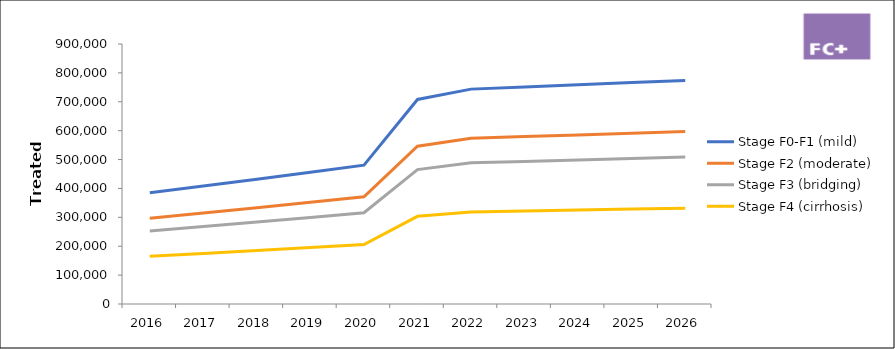
| Category | Stage F0-F1 (mild) | Stage F2 (moderate) | Stage F3 (bridging) | Stage F4 (cirrhosis) |
|---|---|---|---|---|
| 2016.0 | 385000 | 297000 | 253000 | 165000 |
| 2017.0 | 408292.5 | 314968.5 | 268306.5 | 174982.5 |
| 2018.0 | 432012.35 | 333266.67 | 283893.83 | 185148.15 |
| 2019.0 | 456165.768 | 351899.307 | 299766.076 | 195499.615 |
| 2020.0 | 480759.053 | 370871.269 | 315927.377 | 206039.594 |
| 2021.0 | 708118.021 | 546262.474 | 465334.7 | 303479.152 |
| 2022.0 | 743807.17 | 573794.102 | 488787.569 | 318774.501 |
| 2023.0 | 751245.241 | 579532.043 | 493675.444 | 321962.246 |
| 2024.0 | 758757.694 | 585327.364 | 498612.199 | 325181.869 |
| 2025.0 | 766345.271 | 591180.637 | 503598.321 | 328433.687 |
| 2026.0 | 774008.723 | 597092.444 | 508634.304 | 331718.024 |